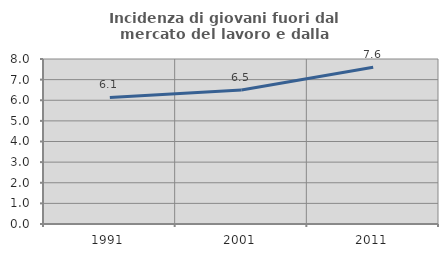
| Category | Incidenza di giovani fuori dal mercato del lavoro e dalla formazione  |
|---|---|
| 1991.0 | 6.135 |
| 2001.0 | 6.499 |
| 2011.0 | 7.604 |